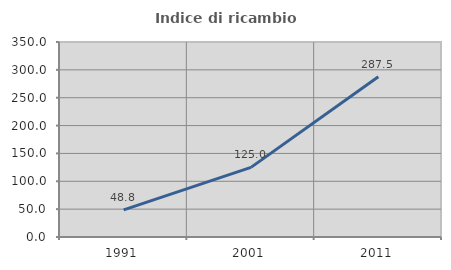
| Category | Indice di ricambio occupazionale  |
|---|---|
| 1991.0 | 48.75 |
| 2001.0 | 125 |
| 2011.0 | 287.5 |